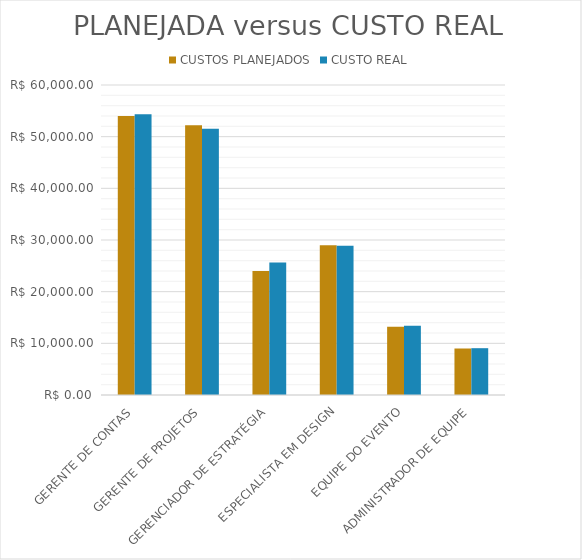
| Category | CUSTOS PLANEJADOS | CUSTO REAL |
|---|---|---|
| GERENTE DE CONTAS | 54000 | 54360 |
| GERENTE DE PROJETOS | 52200 | 51540 |
| GERENCIADOR DE ESTRATÉGIA | 24000 | 25650 |
| ESPECIALISTA EM DESIGN | 29000 | 28900 |
| EQUIPE DO EVENTO | 13200 | 13400 |
| ADMINISTRADOR DE EQUIPE | 9000 | 9060 |